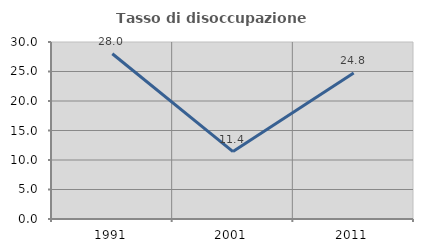
| Category | Tasso di disoccupazione giovanile  |
|---|---|
| 1991.0 | 28.011 |
| 2001.0 | 11.424 |
| 2011.0 | 24.754 |